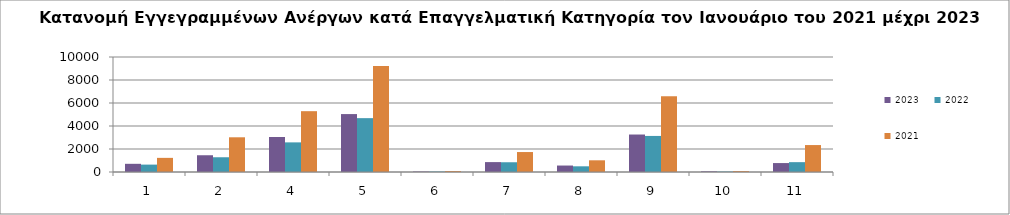
| Category | 2023 | 2022 | 2021 |
|---|---|---|---|
| 1.0 | 712 | 643 | 1229 |
| 2.0 | 1457 | 1282 | 3018 |
| 4.0 | 3043 | 2576 | 5289 |
| 5.0 | 5037 | 4683 | 9212 |
| 6.0 | 41 | 39 | 83 |
| 7.0 | 861 | 848 | 1736 |
| 8.0 | 562 | 495 | 1017 |
| 9.0 | 3259 | 3136 | 6590 |
| 10.0 | 59 | 38 | 81 |
| 11.0 | 777 | 856 | 2343 |